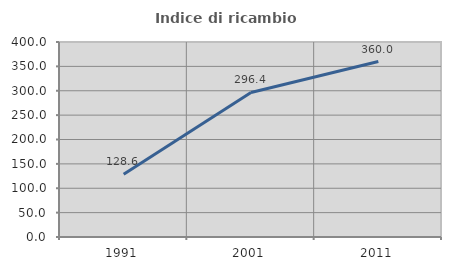
| Category | Indice di ricambio occupazionale  |
|---|---|
| 1991.0 | 128.571 |
| 2001.0 | 296.429 |
| 2011.0 | 360 |